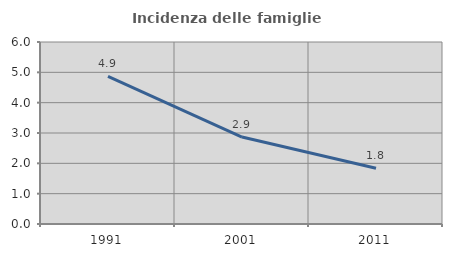
| Category | Incidenza delle famiglie numerose |
|---|---|
| 1991.0 | 4.869 |
| 2001.0 | 2.868 |
| 2011.0 | 1.839 |